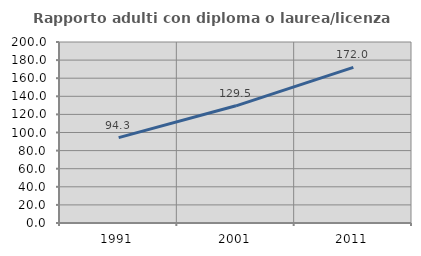
| Category | Rapporto adulti con diploma o laurea/licenza media  |
|---|---|
| 1991.0 | 94.3 |
| 2001.0 | 129.487 |
| 2011.0 | 172 |